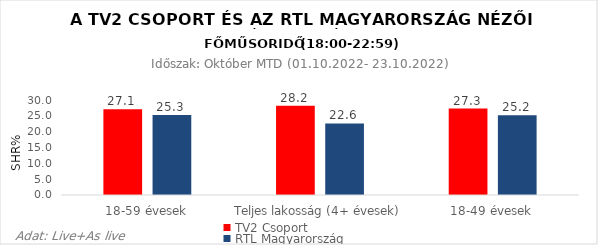
| Category | TV2 Csoport | RTL Magyarország |
|---|---|---|
| 18-59 évesek | 27.1 | 25.3 |
| Teljes lakosság (4+ évesek) | 28.2 | 22.6 |
| 18-49 évesek | 27.3 | 25.2 |